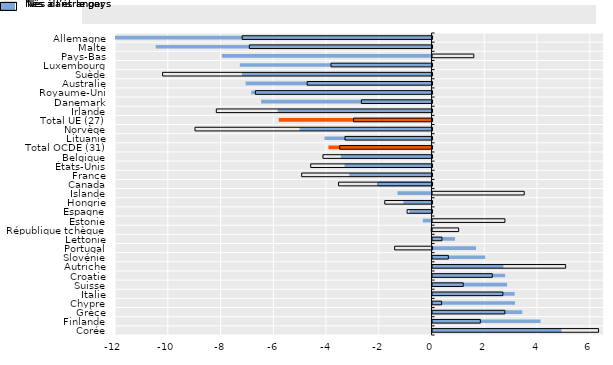
| Category | Nés à l’étranger | Nés dans le pays |
|---|---|---|
| Allemagne | -14.733 | -7.199 |
| Malte | -10.456 | -6.926 |
| Pays-Bas | -7.948 | 1.565 |
| Luxembourg | -7.267 | -3.83 |
| Suède | -7.189 | -10.215 |
| Australie | -7.048 | -4.735 |
| Royaume-Uni | -6.834 | -6.698 |
| Danemark | -6.46 | -2.679 |
| Irlande | -5.832 | -8.179 |
| Total UE (27) | -5.794 | -2.975 |
| Norvège | -5.003 | -8.986 |
| Lituanie | -4.058 | -3.301 |
| Total OCDE (31) | -3.909 | -3.501 |
| Belgique | -3.436 | -4.136 |
| États-Unis | -3.3 | -4.6 |
| France | -3.12 | -4.943 |
| Canada | -2.051 | -3.547 |
| Islande | -1.291 | 3.476 |
| Hongrie | -1.062 | -1.792 |
| Espagne | -0.841 | -0.946 |
| Estonie | -0.33 | 2.745 |
| République tchèque | -0.049 | 0.99 |
| Lettonie | 0.853 | 0.356 |
| Portugal | 1.649 | -1.418 |
| Slovénie | 1.994 | 0.599 |
| Autriche | 2.686 | 5.046 |
| Croatie | 2.751 | 2.267 |
| Suisse | 2.825 | 1.163 |
| Italie | 3.114 | 2.667 |
| Chypre | 3.127 | 0.343 |
| Grèce | 3.403 | 2.741 |
| Finlande | 4.093 | 1.811 |
| Corée | 4.887 | 6.294 |